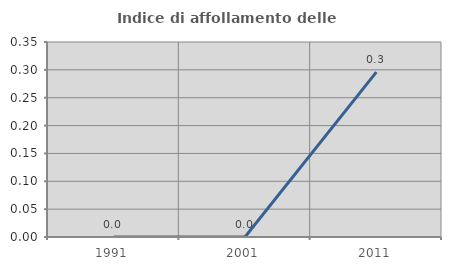
| Category | Indice di affollamento delle abitazioni  |
|---|---|
| 1991.0 | 0 |
| 2001.0 | 0 |
| 2011.0 | 0.296 |